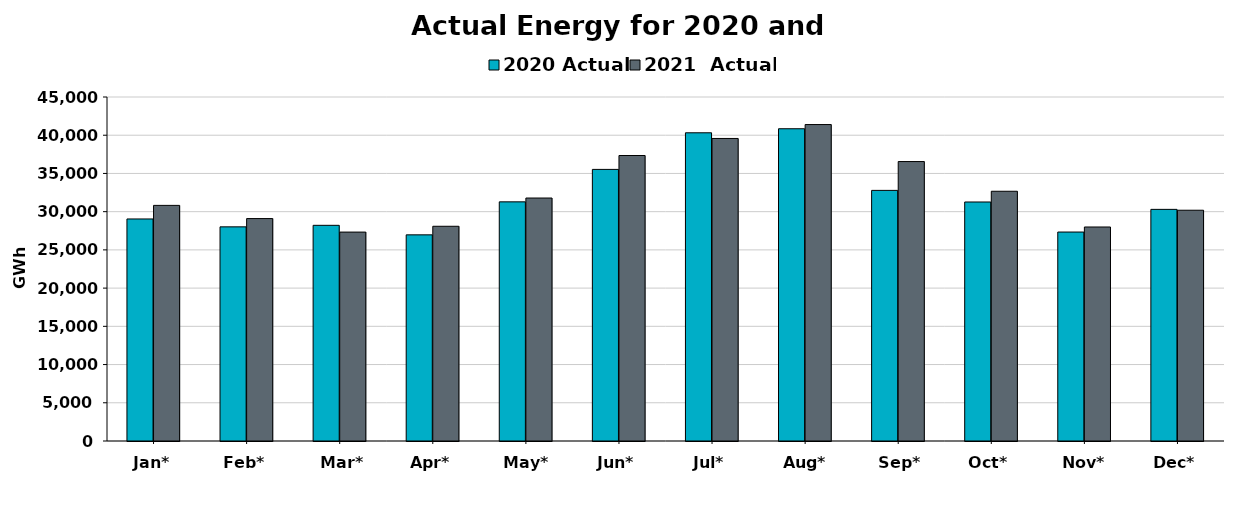
| Category | 2020 Actual | 2021  Actual |
|---|---|---|
| Jan* | 29045 | 30822 |
| Feb* | 28014 | 29096 |
| Mar* | 28214 | 27328 |
| Apr* | 26968 | 28090 |
| May* | 31283 | 31785 |
| Jun* | 35530 | 37346 |
| Jul* | 40318 | 39577 |
| Aug* | 40847 | 41396 |
| Sep* | 32785 | 36555 |
| Oct* | 31266 | 32670 |
| Nov* | 27335 | 27996 |
| Dec* | 30301 | 30188 |